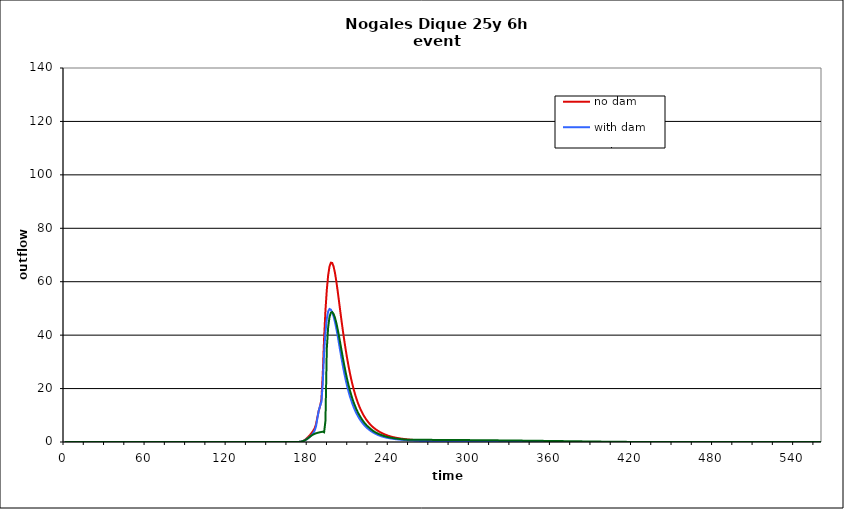
| Category | no dam | with dam | with dam/pond |
|---|---|---|---|
| 0.0 | 0 | 0 | 0 |
| 1.0 | 0 | 0 | 0 |
| 2.0 | 0 | 0 | 0 |
| 3.0 | 0 | 0 | 0 |
| 4.0 | 0 | 0 | 0 |
| 5.0 | 0 | 0 | 0 |
| 6.0 | 0 | 0 | 0 |
| 7.0 | 0 | 0 | 0 |
| 8.0 | 0 | 0 | 0 |
| 9.0 | 0 | 0 | 0 |
| 10.0 | 0 | 0 | 0 |
| 11.0 | 0 | 0 | 0 |
| 12.0 | 0 | 0 | 0 |
| 13.0 | 0 | 0 | 0 |
| 14.0 | 0 | 0 | 0 |
| 15.0 | 0 | 0 | 0 |
| 16.0 | 0 | 0 | 0 |
| 17.0 | 0 | 0 | 0 |
| 18.0 | 0 | 0 | 0 |
| 19.0 | 0 | 0 | 0 |
| 20.0 | 0 | 0 | 0 |
| 21.0 | 0 | 0 | 0 |
| 22.0 | 0 | 0 | 0 |
| 23.0 | 0 | 0 | 0 |
| 24.0 | 0 | 0 | 0 |
| 25.0 | 0 | 0 | 0 |
| 26.0 | 0 | 0 | 0 |
| 27.0 | 0 | 0 | 0 |
| 28.0 | 0 | 0 | 0 |
| 29.0 | 0 | 0 | 0 |
| 30.0 | 0 | 0 | 0 |
| 31.0 | 0 | 0 | 0 |
| 32.0 | 0 | 0 | 0 |
| 33.0 | 0 | 0 | 0 |
| 34.0 | 0 | 0 | 0 |
| 35.0 | 0 | 0 | 0 |
| 36.0 | 0 | 0 | 0 |
| 37.0 | 0 | 0 | 0 |
| 38.0 | 0 | 0 | 0 |
| 39.0 | 0 | 0 | 0 |
| 40.0 | 0 | 0 | 0 |
| 41.0 | 0 | 0 | 0 |
| 42.0 | 0 | 0 | 0 |
| 43.0 | 0 | 0 | 0 |
| 44.0 | 0 | 0 | 0 |
| 45.0 | 0 | 0 | 0 |
| 46.0 | 0 | 0 | 0 |
| 47.0 | 0 | 0 | 0 |
| 48.0 | 0 | 0 | 0 |
| 49.0 | 0 | 0 | 0 |
| 50.0 | 0 | 0 | 0 |
| 51.0 | 0 | 0 | 0 |
| 52.0 | 0 | 0 | 0 |
| 53.0 | 0 | 0 | 0 |
| 54.0 | 0 | 0 | 0 |
| 55.0 | 0 | 0 | 0 |
| 56.0 | 0 | 0 | 0 |
| 57.0 | 0 | 0 | 0 |
| 58.0 | 0 | 0 | 0 |
| 59.0 | 0 | 0 | 0 |
| 60.0 | 0 | 0 | 0 |
| 61.0 | 0 | 0 | 0 |
| 62.0 | 0 | 0 | 0 |
| 63.0 | 0 | 0 | 0 |
| 64.0 | 0 | 0 | 0 |
| 65.0 | 0 | 0 | 0 |
| 66.0 | 0 | 0 | 0 |
| 67.0 | 0 | 0 | 0 |
| 68.0 | 0 | 0 | 0 |
| 69.0 | 0 | 0 | 0 |
| 70.0 | 0 | 0 | 0 |
| 71.0 | 0 | 0 | 0 |
| 72.0 | 0 | 0 | 0 |
| 73.0 | 0 | 0 | 0 |
| 74.0 | 0 | 0 | 0 |
| 75.0 | 0 | 0 | 0 |
| 76.0 | 0 | 0 | 0 |
| 77.0 | 0 | 0 | 0 |
| 78.0 | 0 | 0 | 0 |
| 79.0 | 0 | 0 | 0 |
| 80.0 | 0 | 0 | 0 |
| 81.0 | 0 | 0 | 0 |
| 82.0 | 0 | 0 | 0 |
| 83.0 | 0 | 0 | 0 |
| 84.0 | 0 | 0 | 0 |
| 85.0 | 0 | 0 | 0 |
| 86.0 | 0 | 0 | 0 |
| 87.0 | 0 | 0 | 0 |
| 88.0 | 0 | 0 | 0 |
| 89.0 | 0 | 0 | 0 |
| 90.0 | 0 | 0 | 0 |
| 91.0 | 0 | 0 | 0 |
| 92.0 | 0 | 0 | 0 |
| 93.0 | 0 | 0 | 0 |
| 94.0 | 0 | 0 | 0 |
| 95.0 | 0 | 0 | 0 |
| 96.0 | 0 | 0 | 0 |
| 97.0 | 0 | 0 | 0 |
| 98.0 | 0 | 0 | 0 |
| 99.0 | 0 | 0 | 0 |
| 100.0 | 0 | 0 | 0 |
| 101.0 | 0 | 0 | 0 |
| 102.0 | 0 | 0 | 0 |
| 103.0 | 0 | 0 | 0 |
| 104.0 | 0 | 0 | 0 |
| 105.0 | 0 | 0 | 0 |
| 106.0 | 0 | 0 | 0 |
| 107.0 | 0 | 0 | 0 |
| 108.0 | 0 | 0 | 0 |
| 109.0 | 0 | 0 | 0 |
| 110.0 | 0 | 0 | 0 |
| 111.0 | 0 | 0 | 0 |
| 112.0 | 0 | 0 | 0 |
| 113.0 | 0 | 0 | 0 |
| 114.0 | 0 | 0 | 0 |
| 115.0 | 0 | 0 | 0 |
| 116.0 | 0 | 0 | 0 |
| 117.0 | 0 | 0 | 0 |
| 118.0 | 0 | 0 | 0 |
| 119.0 | 0 | 0 | 0 |
| 120.0 | 0 | 0 | 0 |
| 121.0 | 0 | 0 | 0 |
| 122.0 | 0 | 0 | 0 |
| 123.0 | 0 | 0 | 0 |
| 124.0 | 0 | 0 | 0 |
| 125.0 | 0 | 0 | 0 |
| 126.0 | 0 | 0 | 0 |
| 127.0 | 0 | 0 | 0 |
| 128.0 | 0 | 0 | 0 |
| 129.0 | 0 | 0 | 0 |
| 130.0 | 0 | 0 | 0 |
| 131.0 | 0 | 0 | 0 |
| 132.0 | 0 | 0 | 0 |
| 133.0 | 0 | 0 | 0 |
| 134.0 | 0 | 0 | 0 |
| 135.0 | 0 | 0 | 0 |
| 136.0 | 0 | 0 | 0 |
| 137.0 | 0 | 0 | 0 |
| 138.0 | 0 | 0 | 0 |
| 139.0 | 0 | 0 | 0 |
| 140.0 | 0 | 0 | 0 |
| 141.0 | 0 | 0 | 0 |
| 142.0 | 0 | 0 | 0 |
| 143.0 | 0 | 0 | 0 |
| 144.0 | 0 | 0 | 0 |
| 145.0 | 0 | 0 | 0 |
| 146.0 | 0 | 0 | 0 |
| 147.0 | 0 | 0 | 0 |
| 148.0 | 0 | 0 | 0 |
| 149.0 | 0 | 0 | 0 |
| 150.0 | 0 | 0 | 0 |
| 151.0 | 0 | 0 | 0 |
| 152.0 | 0 | 0 | 0 |
| 153.0 | 0 | 0 | 0 |
| 154.0 | 0 | 0 | 0 |
| 155.0 | 0 | 0 | 0 |
| 156.0 | 0 | 0 | 0 |
| 157.0 | 0 | 0 | 0 |
| 158.0 | 0 | 0 | 0 |
| 159.0 | 0 | 0 | 0 |
| 160.0 | 0 | 0 | 0 |
| 161.0 | 0 | 0 | 0 |
| 162.0 | 0 | 0 | 0 |
| 163.0 | 0 | 0 | 0 |
| 164.0 | 0 | 0 | 0 |
| 165.0 | 0 | 0 | 0 |
| 166.0 | 0 | 0 | 0 |
| 167.0 | 0 | 0 | 0 |
| 168.0 | 0 | 0 | 0 |
| 169.0 | 0 | 0 | 0 |
| 170.0 | 0 | 0 | 0 |
| 171.0 | 0 | 0.001 | 0.001 |
| 172.0 | 0.003 | 0.007 | 0.007 |
| 173.0 | 0.017 | 0.026 | 0.026 |
| 174.0 | 0.056 | 0.069 | 0.069 |
| 175.0 | 0.139 | 0.147 | 0.147 |
| 176.0 | 0.294 | 0.27 | 0.268 |
| 177.0 | 0.536 | 0.448 | 0.447 |
| 178.0 | 0.87 | 0.693 | 0.69 |
| 179.0 | 1.284 | 1 | 0.999 |
| 180.0 | 1.762 | 1.36 | 1.358 |
| 181.0 | 2.296 | 1.762 | 1.757 |
| 182.0 | 2.885 | 2.191 | 2.169 |
| 183.0 | 3.55 | 2.688 | 2.54 |
| 184.0 | 4.256 | 3.377 | 2.834 |
| 185.0 | 5.098 | 4.296 | 3.066 |
| 186.0 | 6.666 | 5.804 | 3.255 |
| 187.0 | 9.206 | 8.804 | 3.403 |
| 188.0 | 11.634 | 11.645 | 3.53 |
| 189.0 | 13.402 | 13.436 | 3.653 |
| 190.0 | 15.882 | 14.995 | 3.78 |
| 191.0 | 25.336 | 21.877 | 3.82 |
| 192.0 | 38.768 | 33.466 | 3.621 |
| 193.0 | 49.194 | 40.988 | 7.873 |
| 194.0 | 56.936 | 46.081 | 34.889 |
| 195.0 | 62.378 | 48.89 | 42.892 |
| 196.0 | 65.699 | 49.782 | 46.801 |
| 197.0 | 67.122 | 49.538 | 48.413 |
| 198.0 | 67.031 | 48.581 | 48.633 |
| 199.0 | 65.735 | 47.068 | 47.938 |
| 200.0 | 63.427 | 45.061 | 46.588 |
| 201.0 | 60.326 | 42.623 | 44.715 |
| 202.0 | 56.704 | 39.862 | 42.343 |
| 203.0 | 52.808 | 36.916 | 39.692 |
| 204.0 | 48.86 | 33.918 | 36.895 |
| 205.0 | 44.993 | 30.985 | 34.021 |
| 206.0 | 41.287 | 28.193 | 31.208 |
| 207.0 | 37.788 | 25.587 | 28.501 |
| 208.0 | 34.513 | 23.192 | 25.95 |
| 209.0 | 31.468 | 21.015 | 23.616 |
| 210.0 | 28.648 | 19.045 | 21.443 |
| 211.0 | 26.047 | 17.265 | 19.503 |
| 212.0 | 23.661 | 15.656 | 17.737 |
| 213.0 | 21.484 | 14.203 | 16.104 |
| 214.0 | 19.508 | 12.894 | 14.655 |
| 215.0 | 17.723 | 11.714 | 13.368 |
| 216.0 | 16.113 | 10.658 | 12.153 |
| 217.0 | 14.664 | 9.707 | 11.065 |
| 218.0 | 13.367 | 8.848 | 10.121 |
| 219.0 | 12.2 | 8.071 | 9.279 |
| 220.0 | 11.15 | 7.369 | 8.487 |
| 221.0 | 10.202 | 6.732 | 7.74 |
| 222.0 | 9.345 | 6.155 | 7.076 |
| 223.0 | 8.569 | 5.632 | 6.496 |
| 224.0 | 7.867 | 5.157 | 5.983 |
| 225.0 | 7.23 | 4.727 | 5.519 |
| 226.0 | 6.652 | 4.336 | 5.08 |
| 227.0 | 6.127 | 3.981 | 4.655 |
| 228.0 | 5.649 | 3.657 | 4.266 |
| 229.0 | 5.214 | 3.361 | 3.922 |
| 230.0 | 4.817 | 3.091 | 3.62 |
| 231.0 | 4.455 | 2.843 | 3.35 |
| 232.0 | 4.124 | 2.616 | 3.106 |
| 233.0 | 3.82 | 2.409 | 2.883 |
| 234.0 | 3.541 | 2.22 | 2.68 |
| 235.0 | 3.283 | 2.05 | 2.494 |
| 236.0 | 3.044 | 1.9 | 2.32 |
| 237.0 | 2.824 | 1.767 | 2.156 |
| 238.0 | 2.62 | 1.649 | 2.004 |
| 239.0 | 2.431 | 1.541 | 1.87 |
| 240.0 | 2.259 | 1.443 | 1.752 |
| 241.0 | 2.105 | 1.353 | 1.647 |
| 242.0 | 1.966 | 1.271 | 1.552 |
| 243.0 | 1.84 | 1.195 | 1.465 |
| 244.0 | 1.724 | 1.125 | 1.386 |
| 245.0 | 1.618 | 1.06 | 1.313 |
| 246.0 | 1.521 | 0.999 | 1.245 |
| 247.0 | 1.431 | 0.943 | 1.182 |
| 248.0 | 1.348 | 0.89 | 1.124 |
| 249.0 | 1.271 | 0.842 | 1.069 |
| 250.0 | 1.2 | 0.796 | 1.018 |
| 251.0 | 1.134 | 0.753 | 0.971 |
| 252.0 | 1.072 | 0.713 | 0.928 |
| 253.0 | 1.014 | 0.676 | 0.891 |
| 254.0 | 0.96 | 0.641 | 0.864 |
| 255.0 | 0.909 | 0.608 | 0.846 |
| 256.0 | 0.861 | 0.577 | 0.835 |
| 257.0 | 0.816 | 0.548 | 0.83 |
| 258.0 | 0.774 | 0.52 | 0.827 |
| 259.0 | 0.735 | 0.495 | 0.825 |
| 260.0 | 0.698 | 0.47 | 0.823 |
| 261.0 | 0.663 | 0.447 | 0.821 |
| 262.0 | 0.63 | 0.426 | 0.819 |
| 263.0 | 0.599 | 0.406 | 0.817 |
| 264.0 | 0.57 | 0.386 | 0.815 |
| 265.0 | 0.543 | 0.368 | 0.813 |
| 266.0 | 0.517 | 0.351 | 0.81 |
| 267.0 | 0.492 | 0.335 | 0.808 |
| 268.0 | 0.47 | 0.32 | 0.806 |
| 269.0 | 0.448 | 0.306 | 0.803 |
| 270.0 | 0.427 | 0.292 | 0.801 |
| 271.0 | 0.408 | 0.279 | 0.798 |
| 272.0 | 0.39 | 0.267 | 0.795 |
| 273.0 | 0.372 | 0.255 | 0.793 |
| 274.0 | 0.356 | 0.244 | 0.79 |
| 275.0 | 0.34 | 0.234 | 0.787 |
| 276.0 | 0.325 | 0.224 | 0.784 |
| 277.0 | 0.311 | 0.215 | 0.781 |
| 278.0 | 0.298 | 0.206 | 0.778 |
| 279.0 | 0.285 | 0.197 | 0.775 |
| 280.0 | 0.273 | 0.189 | 0.772 |
| 281.0 | 0.262 | 0.182 | 0.769 |
| 282.0 | 0.251 | 0.174 | 0.766 |
| 283.0 | 0.241 | 0.167 | 0.762 |
| 284.0 | 0.231 | 0.161 | 0.759 |
| 285.0 | 0.221 | 0.154 | 0.756 |
| 286.0 | 0.212 | 0.148 | 0.752 |
| 287.0 | 0.204 | 0.143 | 0.749 |
| 288.0 | 0.196 | 0.137 | 0.746 |
| 289.0 | 0.188 | 0.132 | 0.742 |
| 290.0 | 0.181 | 0.127 | 0.739 |
| 291.0 | 0.174 | 0.122 | 0.735 |
| 292.0 | 0.167 | 0.118 | 0.731 |
| 293.0 | 0.161 | 0.113 | 0.728 |
| 294.0 | 0.155 | 0.109 | 0.724 |
| 295.0 | 0.149 | 0.105 | 0.721 |
| 296.0 | 0.143 | 0.101 | 0.717 |
| 297.0 | 0.138 | 0.098 | 0.713 |
| 298.0 | 0.133 | 0.094 | 0.709 |
| 299.0 | 0.128 | 0.091 | 0.706 |
| 300.0 | 0.123 | 0.088 | 0.702 |
| 301.0 | 0.119 | 0.085 | 0.698 |
| 302.0 | 0.114 | 0.082 | 0.694 |
| 303.0 | 0.11 | 0.079 | 0.69 |
| 304.0 | 0.106 | 0.076 | 0.686 |
| 305.0 | 0.102 | 0.073 | 0.682 |
| 306.0 | 0.099 | 0.071 | 0.678 |
| 307.0 | 0.095 | 0.069 | 0.674 |
| 308.0 | 0.092 | 0.066 | 0.67 |
| 309.0 | 0.089 | 0.064 | 0.666 |
| 310.0 | 0.086 | 0.062 | 0.662 |
| 311.0 | 0.083 | 0.06 | 0.657 |
| 312.0 | 0.08 | 0.058 | 0.653 |
| 313.0 | 0.077 | 0.056 | 0.648 |
| 314.0 | 0.075 | 0.054 | 0.643 |
| 315.0 | 0.072 | 0.053 | 0.638 |
| 316.0 | 0.07 | 0.051 | 0.633 |
| 317.0 | 0.067 | 0.049 | 0.628 |
| 318.0 | 0.065 | 0.048 | 0.623 |
| 319.0 | 0.063 | 0.046 | 0.618 |
| 320.0 | 0.061 | 0.045 | 0.613 |
| 321.0 | 0.059 | 0.044 | 0.608 |
| 322.0 | 0.057 | 0.042 | 0.603 |
| 323.0 | 0.055 | 0.041 | 0.598 |
| 324.0 | 0.053 | 0.04 | 0.593 |
| 325.0 | 0.052 | 0.038 | 0.587 |
| 326.0 | 0.05 | 0.037 | 0.582 |
| 327.0 | 0.048 | 0.036 | 0.577 |
| 328.0 | 0.047 | 0.035 | 0.572 |
| 329.0 | 0.045 | 0.034 | 0.566 |
| 330.0 | 0.044 | 0.033 | 0.561 |
| 331.0 | 0.042 | 0.032 | 0.556 |
| 332.0 | 0.041 | 0.031 | 0.55 |
| 333.0 | 0.04 | 0.03 | 0.545 |
| 334.0 | 0.039 | 0.029 | 0.54 |
| 335.0 | 0.037 | 0.029 | 0.534 |
| 336.0 | 0.036 | 0.028 | 0.529 |
| 337.0 | 0.035 | 0.027 | 0.523 |
| 338.0 | 0.034 | 0.026 | 0.518 |
| 339.0 | 0.033 | 0.026 | 0.512 |
| 340.0 | 0.032 | 0.025 | 0.507 |
| 341.0 | 0.031 | 0.024 | 0.501 |
| 342.0 | 0.03 | 0.024 | 0.496 |
| 343.0 | 0.029 | 0.023 | 0.49 |
| 344.0 | 0.028 | 0.022 | 0.484 |
| 345.0 | 0.027 | 0.022 | 0.478 |
| 346.0 | 0.027 | 0.021 | 0.472 |
| 347.0 | 0.026 | 0.02 | 0.466 |
| 348.0 | 0.025 | 0.02 | 0.46 |
| 349.0 | 0.024 | 0.019 | 0.454 |
| 350.0 | 0.024 | 0.019 | 0.448 |
| 351.0 | 0.023 | 0.018 | 0.442 |
| 352.0 | 0.022 | 0.018 | 0.435 |
| 353.0 | 0.021 | 0.017 | 0.429 |
| 354.0 | 0.021 | 0.017 | 0.423 |
| 355.0 | 0.02 | 0.017 | 0.417 |
| 356.0 | 0.02 | 0.016 | 0.41 |
| 357.0 | 0.019 | 0.016 | 0.404 |
| 358.0 | 0.019 | 0.015 | 0.398 |
| 359.0 | 0.018 | 0.015 | 0.391 |
| 360.0 | 0.017 | 0.015 | 0.385 |
| 361.0 | 0.017 | 0.014 | 0.379 |
| 362.0 | 0.016 | 0.014 | 0.372 |
| 363.0 | 0.016 | 0.013 | 0.366 |
| 364.0 | 0.016 | 0.013 | 0.36 |
| 365.0 | 0.015 | 0.013 | 0.353 |
| 366.0 | 0.015 | 0.012 | 0.347 |
| 367.0 | 0.014 | 0.012 | 0.341 |
| 368.0 | 0.014 | 0.012 | 0.334 |
| 369.0 | 0.013 | 0.011 | 0.328 |
| 370.0 | 0.013 | 0.011 | 0.321 |
| 371.0 | 0.012 | 0.011 | 0.315 |
| 372.0 | 0.012 | 0.011 | 0.308 |
| 373.0 | 0.012 | 0.01 | 0.301 |
| 374.0 | 0.011 | 0.01 | 0.295 |
| 375.0 | 0.011 | 0.01 | 0.288 |
| 376.0 | 0.011 | 0.009 | 0.281 |
| 377.0 | 0.01 | 0.009 | 0.274 |
| 378.0 | 0.01 | 0.009 | 0.267 |
| 379.0 | 0.009 | 0.009 | 0.26 |
| 380.0 | 0.009 | 0.008 | 0.253 |
| 381.0 | 0.009 | 0.008 | 0.247 |
| 382.0 | 0.008 | 0.008 | 0.24 |
| 383.0 | 0.008 | 0.007 | 0.233 |
| 384.0 | 0.008 | 0.007 | 0.227 |
| 385.0 | 0.007 | 0.007 | 0.22 |
| 386.0 | 0.007 | 0.007 | 0.213 |
| 387.0 | 0.007 | 0.007 | 0.207 |
| 388.0 | 0.006 | 0.006 | 0.2 |
| 389.0 | 0.006 | 0.006 | 0.194 |
| 390.0 | 0.006 | 0.006 | 0.187 |
| 391.0 | 0.006 | 0.006 | 0.181 |
| 392.0 | 0.005 | 0.005 | 0.175 |
| 393.0 | 0.005 | 0.005 | 0.168 |
| 394.0 | 0.005 | 0.005 | 0.162 |
| 395.0 | 0.005 | 0.005 | 0.155 |
| 396.0 | 0.004 | 0.005 | 0.148 |
| 397.0 | 0.004 | 0.004 | 0.141 |
| 398.0 | 0.004 | 0.004 | 0.134 |
| 399.0 | 0.004 | 0.004 | 0.127 |
| 400.0 | 0.003 | 0.004 | 0.12 |
| 401.0 | 0.003 | 0.004 | 0.113 |
| 402.0 | 0.003 | 0.003 | 0.107 |
| 403.0 | 0.003 | 0.003 | 0.101 |
| 404.0 | 0.003 | 0.003 | 0.095 |
| 405.0 | 0.002 | 0.003 | 0.089 |
| 406.0 | 0.002 | 0.003 | 0.084 |
| 407.0 | 0.002 | 0.003 | 0.079 |
| 408.0 | 0.002 | 0.003 | 0.074 |
| 409.0 | 0.002 | 0.002 | 0.07 |
| 410.0 | 0.002 | 0.002 | 0.066 |
| 411.0 | 0.001 | 0.002 | 0.062 |
| 412.0 | 0.001 | 0.002 | 0.058 |
| 413.0 | 0.001 | 0.002 | 0.055 |
| 414.0 | 0.001 | 0.002 | 0.052 |
| 415.0 | 0.001 | 0.002 | 0.049 |
| 416.0 | 0.001 | 0.001 | 0.046 |
| 417.0 | 0.001 | 0.001 | 0.044 |
| 418.0 | 0.001 | 0.001 | 0.041 |
| 419.0 | 0.001 | 0.001 | 0.039 |
| 420.0 | 0.001 | 0.001 | 0.037 |
| 421.0 | 0.001 | 0.001 | 0.035 |
| 422.0 | 0 | 0.001 | 0.033 |
| 423.0 | 0 | 0.001 | 0.032 |
| 424.0 | 0 | 0.001 | 0.03 |
| 425.0 | 0 | 0.001 | 0.028 |
| 426.0 | 0 | 0.001 | 0.027 |
| 427.0 | 0 | 0.001 | 0.026 |
| 428.0 | 0 | 0.001 | 0.024 |
| 429.0 | 0 | 0 | 0.023 |
| 430.0 | 0 | 0 | 0.022 |
| 431.0 | 0 | 0 | 0.021 |
| 432.0 | 0 | 0 | 0.02 |
| 433.0 | 0 | 0 | 0.019 |
| 434.0 | 0 | 0 | 0.018 |
| 435.0 | 0 | 0 | 0.017 |
| 436.0 | 0 | 0 | 0.016 |
| 437.0 | 0 | 0 | 0.016 |
| 438.0 | 0 | 0 | 0.015 |
| 439.0 | 0 | 0 | 0.014 |
| 440.0 | 0 | 0 | 0.014 |
| 441.0 | 0 | 0 | 0.013 |
| 442.0 | 0 | 0 | 0.012 |
| 443.0 | 0 | 0 | 0.012 |
| 444.0 | 0 | 0 | 0.011 |
| 445.0 | 0 | 0 | 0.011 |
| 446.0 | 0 | 0 | 0.01 |
| 447.0 | 0 | 0 | 0.009 |
| 448.0 | 0 | 0 | 0.009 |
| 449.0 | 0 | 0 | 0.008 |
| 450.0 | 0 | 0 | 0.008 |
| 451.0 | 0 | 0 | 0.008 |
| 452.0 | 0 | 0 | 0.007 |
| 453.0 | 0 | 0 | 0.007 |
| 454.0 | 0 | 0 | 0.006 |
| 455.0 | 0 | 0 | 0.006 |
| 456.0 | 0 | 0 | 0.005 |
| 457.0 | 0 | 0 | 0.005 |
| 458.0 | 0 | 0 | 0.005 |
| 459.0 | 0 | 0 | 0.004 |
| 460.0 | 0 | 0 | 0.004 |
| 461.0 | 0 | 0 | 0.004 |
| 462.0 | 0 | 0 | 0.004 |
| 463.0 | 0 | 0 | 0.003 |
| 464.0 | 0 | 0 | 0.003 |
| 465.0 | 0 | 0 | 0.003 |
| 466.0 | 0 | 0 | 0.003 |
| 467.0 | 0 | 0 | 0.002 |
| 468.0 | 0 | 0 | 0.002 |
| 469.0 | 0 | 0 | 0.002 |
| 470.0 | 0 | 0 | 0.002 |
| 471.0 | 0 | 0 | 0.002 |
| 472.0 | 0 | 0 | 0.001 |
| 473.0 | 0 | 0 | 0.001 |
| 474.0 | 0 | 0 | 0.001 |
| 475.0 | 0 | 0 | 0.001 |
| 476.0 | 0 | 0 | 0.001 |
| 477.0 | 0 | 0 | 0.001 |
| 478.0 | 0 | 0 | 0.001 |
| 479.0 | 0 | 0 | 0.001 |
| 480.0 | 0 | 0 | 0.001 |
| 481.0 | 0 | 0 | 0.001 |
| 482.0 | 0 | 0 | 0 |
| 483.0 | 0 | 0 | 0 |
| 484.0 | 0 | 0 | 0 |
| 485.0 | 0 | 0 | 0 |
| 486.0 | 0 | 0 | 0 |
| 487.0 | 0 | 0 | 0 |
| 488.0 | 0 | 0 | 0 |
| 489.0 | 0 | 0 | 0 |
| 490.0 | 0 | 0 | 0 |
| 491.0 | 0 | 0 | 0 |
| 492.0 | 0 | 0 | 0 |
| 493.0 | 0 | 0 | 0 |
| 494.0 | 0 | 0 | 0 |
| 495.0 | 0 | 0 | 0 |
| 496.0 | 0 | 0 | 0 |
| 497.0 | 0 | 0 | 0 |
| 498.0 | 0 | 0 | 0 |
| 499.0 | 0 | 0 | 0 |
| 500.0 | 0 | 0 | 0 |
| 501.0 | 0 | 0 | 0 |
| 502.0 | 0 | 0 | 0 |
| 503.0 | 0 | 0 | 0 |
| 504.0 | 0 | 0 | 0 |
| 505.0 | 0 | 0 | 0 |
| 506.0 | 0 | 0 | 0 |
| 507.0 | 0 | 0 | 0 |
| 508.0 | 0 | 0 | 0 |
| 509.0 | 0 | 0 | 0 |
| 510.0 | 0 | 0 | 0 |
| 511.0 | 0 | 0 | 0 |
| 512.0 | 0 | 0 | 0 |
| 513.0 | 0 | 0 | 0 |
| 514.0 | 0 | 0 | 0 |
| 515.0 | 0 | 0 | 0 |
| 516.0 | 0 | 0 | 0 |
| 517.0 | 0 | 0 | 0 |
| 518.0 | 0 | 0 | 0 |
| 519.0 | 0 | 0 | 0 |
| 520.0 | 0 | 0 | 0 |
| 521.0 | 0 | 0 | 0 |
| 522.0 | 0 | 0 | 0 |
| 523.0 | 0 | 0 | 0 |
| 524.0 | 0 | 0 | 0 |
| 525.0 | 0 | 0 | 0 |
| 526.0 | 0 | 0 | 0 |
| 527.0 | 0 | 0 | 0 |
| 528.0 | 0 | 0 | 0 |
| 529.0 | 0 | 0 | 0 |
| 530.0 | 0 | 0 | 0 |
| 531.0 | 0 | 0 | 0 |
| 532.0 | 0 | 0 | 0 |
| 533.0 | 0 | 0 | 0 |
| 534.0 | 0 | 0 | 0 |
| 535.0 | 0 | 0 | 0 |
| 536.0 | 0 | 0 | 0 |
| 537.0 | 0 | 0 | 0 |
| 538.0 | 0 | 0 | 0 |
| 539.0 | 0 | 0 | 0 |
| 540.0 | 0 | 0 | 0 |
| 541.0 | 0 | 0 | 0 |
| 542.0 | 0 | 0 | 0 |
| 543.0 | 0 | 0 | 0 |
| 544.0 | 0 | 0 | 0 |
| 545.0 | 0 | 0 | 0 |
| 546.0 | 0 | 0 | 0 |
| 547.0 | 0 | 0 | 0 |
| 548.0 | 0 | 0 | 0 |
| 549.0 | 0 | 0 | 0 |
| 550.0 | 0 | 0 | 0 |
| 551.0 | 0 | 0 | 0 |
| 552.0 | 0 | 0 | 0 |
| 553.0 | 0 | 0 | 0 |
| 554.0 | 0 | 0 | 0 |
| 555.0 | 0 | 0 | 0 |
| 556.0 | 0 | 0 | 0 |
| 557.0 | 0 | 0 | 0 |
| 558.0 | 0 | 0 | 0 |
| 559.0 | 0 | 0 | 0 |
| 560.0 | 0 | 0 | 0 |